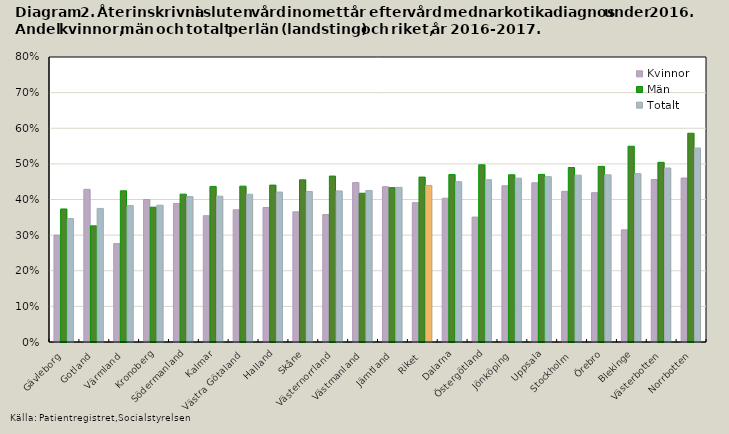
| Category | Kvinnor | Män | Totalt |
|---|---|---|---|
| Gävleborg | 0.3 | 0.373 | 0.346 |
| Gotland | 0.429 | 0.326 | 0.375 |
| Värmland | 0.276 | 0.424 | 0.383 |
| Kronoberg | 0.4 | 0.378 | 0.384 |
| Södermanland | 0.389 | 0.415 | 0.408 |
| Kalmar | 0.354 | 0.437 | 0.409 |
| Västra Götaland | 0.371 | 0.438 | 0.415 |
| Halland | 0.378 | 0.44 | 0.421 |
| Skåne | 0.365 | 0.455 | 0.422 |
| Västernorrland | 0.358 | 0.466 | 0.424 |
| Västmanland | 0.448 | 0.418 | 0.425 |
| Jämtland | 0.436 | 0.433 | 0.434 |
| Riket | 0.391 | 0.463 | 0.44 |
| Dalarna | 0.404 | 0.47 | 0.45 |
| Östergötland | 0.351 | 0.497 | 0.456 |
| Jönköping | 0.439 | 0.469 | 0.46 |
| Uppsala | 0.447 | 0.47 | 0.464 |
| Stockholm | 0.423 | 0.49 | 0.468 |
| Örebro | 0.419 | 0.493 | 0.469 |
| Blekinge | 0.315 | 0.55 | 0.473 |
| Västerbotten | 0.456 | 0.504 | 0.488 |
| Norrbotten | 0.46 | 0.586 | 0.545 |